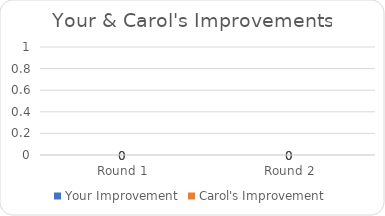
| Category | Your Improvement | Carol's Improvement |
|---|---|---|
| Round 1 | 0 | 0 |
| Round 2 | 0 | 0 |